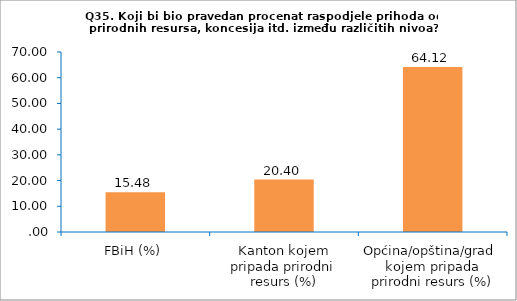
| Category | Series 0 |
|---|---|
| FBiH (%) | 15.483 |
| Kanton kojem pripada prirodni resurs (%) | 20.397 |
| Općina/opština/grad  kojem pripada prirodni resurs (%) | 64.121 |